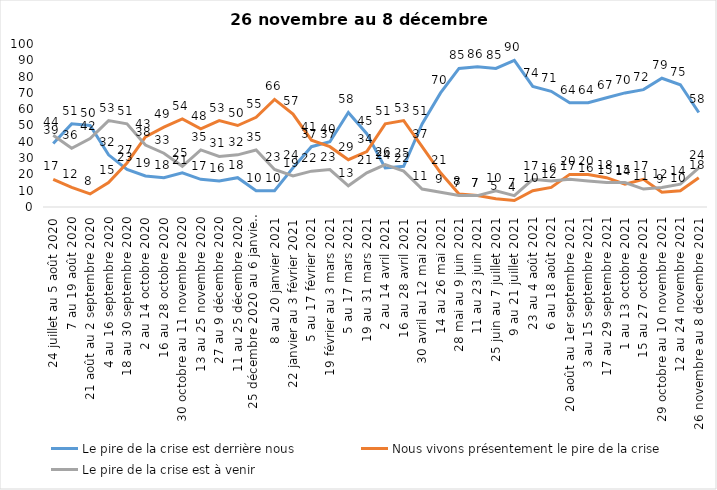
| Category | Le pire de la crise est derrière nous | Nous vivons présentement le pire de la crise | Le pire de la crise est à venir |
|---|---|---|---|
| 24 juillet au 5 août 2020 | 39 | 17 | 44 |
| 7 au 19 août 2020 | 51 | 12 | 36 |
| 21 août au 2 septembre 2020 | 50 | 8 | 42 |
| 4 au 16 septembre 2020 | 32 | 15 | 53 |
| 18 au 30 septembre 2020 | 23 | 27 | 51 |
| 2 au 14 octobre 2020 | 19 | 43 | 38 |
| 16 au 28 octobre 2020 | 18 | 49 | 33 |
| 30 octobre au 11 novembre 2020 | 21 | 54 | 25 |
| 13 au 25 novembre 2020 | 17 | 48 | 35 |
| 27 au 9 décembre 2020 | 16 | 53 | 31 |
| 11 au 25 décembre 2020 | 18 | 50 | 32 |
| 25 décembre 2020 au 6 janvier 2021 | 10 | 55 | 35 |
| 8 au 20 janvier 2021 | 10 | 66 | 23 |
| 22 janvier au 3 février 2021 | 24 | 57 | 19 |
| 5 au 17 février 2021 | 37 | 41 | 22 |
| 19 février au 3 mars 2021 | 40 | 37 | 23 |
| 5 au 17 mars 2021 | 58 | 29 | 13 |
| 19 au 31 mars 2021 | 45 | 34 | 21 |
| 2 au 14 avril 2021 | 24 | 51 | 26 |
| 16 au 28 avril 2021 | 25 | 53 | 22 |
| 30 avril au 12 mai 2021 | 51 | 37 | 11 |
| 14 au 26 mai 2021 | 70 | 21 | 9 |
| 28 mai au 9 juin 2021 | 85 | 8 | 7 |
| 11 au 23 juin 2021 | 86 | 7 | 7 |
| 25 juin au 7 juillet 2021 | 85 | 5 | 10 |
| 9 au 21 juillet 2021 | 90 | 4 | 7 |
| 23 au 4 août 2021 | 74 | 10 | 17 |
| 6 au 18 août 2021 | 71 | 12 | 16 |
| 20 août au 1er septembre 2021 | 64 | 20 | 17 |
| 3 au 15 septembre 2021 | 64 | 20 | 16 |
| 17 au 29 septembre 2021 | 67 | 18 | 15 |
| 1 au 13 octobre 2021 | 70 | 14 | 15 |
| 15 au 27 octobre 2021 | 72 | 17 | 11 |
| 29 octobre au 10 novembre 2021 | 79 | 9 | 12 |
| 12 au 24 novembre 2021 | 75 | 10 | 14 |
| 26 novembre au 8 décembre 2021 | 58 | 18 | 24 |